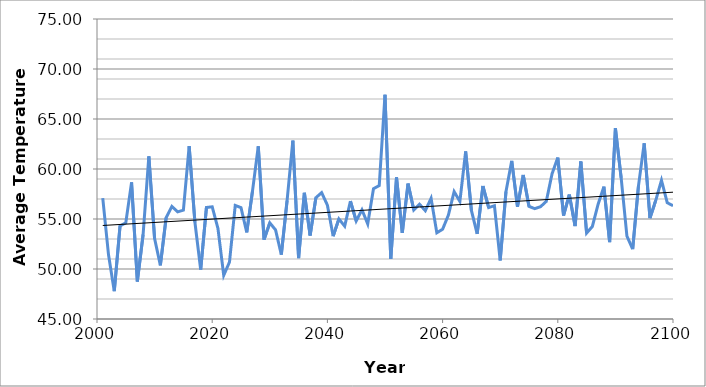
| Category | B1 |
|---|---|
| 2001.0 | 57.094 |
| 2002.0 | 51.422 |
| 2003.0 | 47.782 |
| 2004.0 | 54.315 |
| 2005.0 | 54.624 |
| 2006.0 | 58.665 |
| 2007.0 | 48.753 |
| 2008.0 | 53.42 |
| 2009.0 | 61.268 |
| 2010.0 | 53.044 |
| 2011.0 | 50.364 |
| 2012.0 | 55.125 |
| 2013.0 | 56.26 |
| 2014.0 | 55.708 |
| 2015.0 | 55.893 |
| 2016.0 | 62.29 |
| 2017.0 | 54.675 |
| 2018.0 | 49.946 |
| 2019.0 | 56.151 |
| 2020.0 | 56.221 |
| 2021.0 | 54.052 |
| 2022.0 | 49.365 |
| 2023.0 | 50.693 |
| 2024.0 | 56.358 |
| 2025.0 | 56.136 |
| 2026.0 | 53.661 |
| 2027.0 | 57.814 |
| 2028.0 | 62.269 |
| 2029.0 | 52.943 |
| 2030.0 | 54.617 |
| 2031.0 | 53.908 |
| 2032.0 | 51.435 |
| 2033.0 | 56.835 |
| 2034.0 | 62.836 |
| 2035.0 | 51.094 |
| 2036.0 | 57.623 |
| 2037.0 | 53.346 |
| 2038.0 | 57.126 |
| 2039.0 | 57.637 |
| 2040.0 | 56.383 |
| 2041.0 | 53.281 |
| 2042.0 | 55.004 |
| 2043.0 | 54.284 |
| 2044.0 | 56.786 |
| 2045.0 | 54.801 |
| 2046.0 | 55.922 |
| 2047.0 | 54.509 |
| 2048.0 | 58.032 |
| 2049.0 | 58.345 |
| 2050.0 | 67.422 |
| 2051.0 | 51.017 |
| 2052.0 | 59.162 |
| 2053.0 | 53.611 |
| 2054.0 | 58.539 |
| 2055.0 | 55.906 |
| 2056.0 | 56.473 |
| 2057.0 | 55.83 |
| 2058.0 | 57.067 |
| 2059.0 | 53.622 |
| 2060.0 | 53.976 |
| 2061.0 | 55.382 |
| 2062.0 | 57.738 |
| 2063.0 | 56.757 |
| 2064.0 | 61.752 |
| 2065.0 | 55.852 |
| 2066.0 | 53.512 |
| 2067.0 | 58.298 |
| 2068.0 | 56.138 |
| 2069.0 | 56.331 |
| 2070.0 | 50.851 |
| 2071.0 | 57.74 |
| 2072.0 | 60.814 |
| 2073.0 | 56.224 |
| 2074.0 | 59.407 |
| 2075.0 | 56.26 |
| 2076.0 | 56.035 |
| 2077.0 | 56.226 |
| 2078.0 | 56.763 |
| 2079.0 | 59.517 |
| 2080.0 | 61.144 |
| 2081.0 | 55.348 |
| 2082.0 | 57.438 |
| 2083.0 | 54.293 |
| 2084.0 | 60.75 |
| 2085.0 | 53.596 |
| 2086.0 | 54.259 |
| 2087.0 | 56.478 |
| 2088.0 | 58.233 |
| 2089.0 | 52.691 |
| 2090.0 | 64.092 |
| 2091.0 | 59.119 |
| 2092.0 | 53.289 |
| 2093.0 | 51.98 |
| 2094.0 | 58.285 |
| 2095.0 | 62.571 |
| 2096.0 | 55.09 |
| 2097.0 | 56.847 |
| 2098.0 | 58.869 |
| 2099.0 | 56.628 |
| 2100.0 | 56.329 |